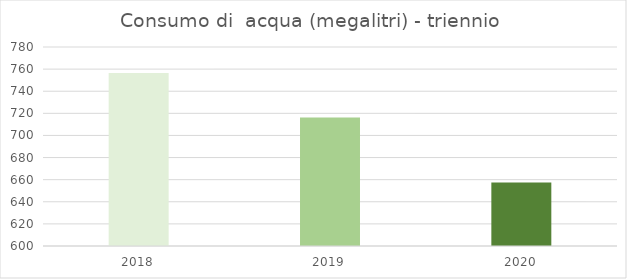
| Category | CONSUMO DI ACQUA (megalitri)  |
|---|---|
| 0 | 756.42 |
| 1 | 716.16 |
| 2 | 657.37 |